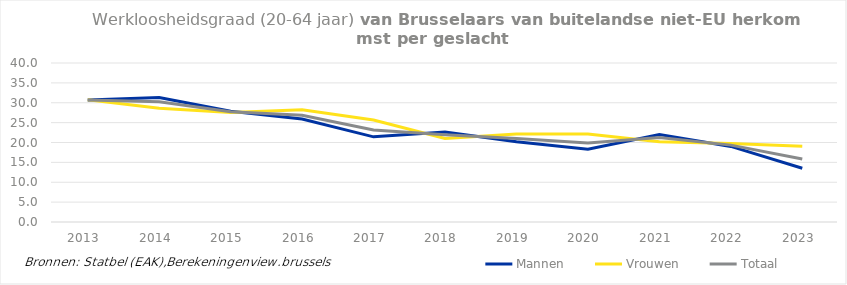
| Category | Mannen | Vrouwen | Totaal |
|---|---|---|---|
| 2013.0 | 30.695 | 30.728 | 30.709 |
| 2014.0 | 31.29 | 28.645 | 30.24 |
| 2015.0 | 27.853 | 27.519 | 27.717 |
| 2016.0 | 25.904 | 28.221 | 26.85 |
| 2017.0 | 21.418 | 25.648 | 23.155 |
| 2018.0 | 22.64 | 21.013 | 21.976 |
| 2019.0 | 20.182 | 22.155 | 20.999 |
| 2020.0 | 18.298 | 22.131 | 19.897 |
| 2021.0 | 22.03 | 20.187 | 21.248 |
| 2022.0 | 19.014 | 19.764 | 19.34 |
| 2023.0 | 13.53 | 19.056 | 15.873 |